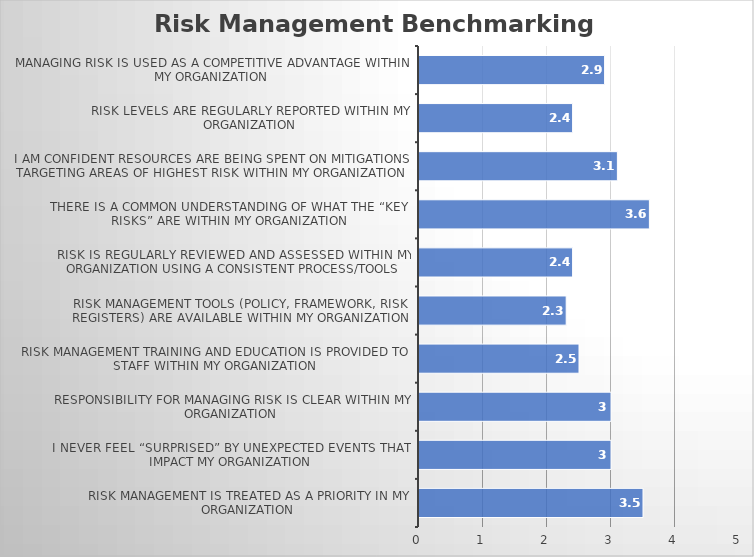
| Category | Series 0 |
|---|---|
| Risk management is treated as a priority in my organization | 3.5 |
| I never feel “surprised” by unexpected events that impact my organization

 | 3 |
| Responsibility for managing risk is clear within my organization | 3 |
| Risk management training and education is provided to staff within my organization | 2.5 |
| Risk management tools (policy, framework, risk registers) are available within my organization | 2.3 |
| Risk is regularly reviewed and assessed within my organization using a consistent process/tools | 2.4 |
| There is a common understanding of what the “key risks” are within my organization

 | 3.6 |
| I am confident resources are being spent on mitigations targeting areas of highest risk within my organization | 3.1 |
| Risk levels are regularly reported within my organization | 2.4 |
| Managing risk is used as a competitive advantage within my organization

 | 2.9 |